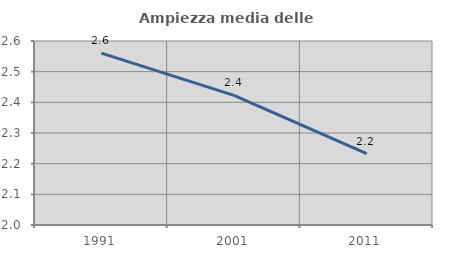
| Category | Ampiezza media delle famiglie |
|---|---|
| 1991.0 | 2.56 |
| 2001.0 | 2.423 |
| 2011.0 | 2.233 |